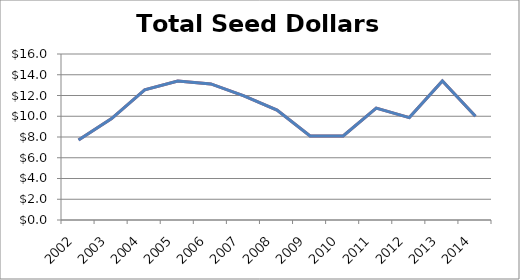
| Category | Total Seed Dollars |
|---|---|
| 2002.0 | 7.719 |
| 2003.0 | 9.777 |
| 2004.0 | 12.554 |
| 2005.0 | 13.389 |
| 2006.0 | 13.118 |
| 2007.0 | 11.972 |
| 2008.0 | 10.597 |
| 2009.0 | 8.097 |
| 2010.0 | 8.1 |
| 2011.0 | 10.785 |
| 2012.0 | 9.87 |
| 2013.0 | 13.403 |
| 2014.0 | 10 |